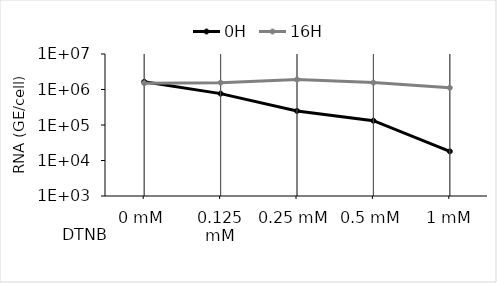
| Category | 0H | 16H |
|---|---|---|
| 0 mM | 1642361.075 | 1505032.302 |
| 0.125 mM | 765706.643 | 1559723.367 |
| 0.25 mM | 249048.496 | 1901483.082 |
| 0.5 mM | 132158.995 | 1562197.777 |
|  1 mM | 18059.681 | 1119756.688 |